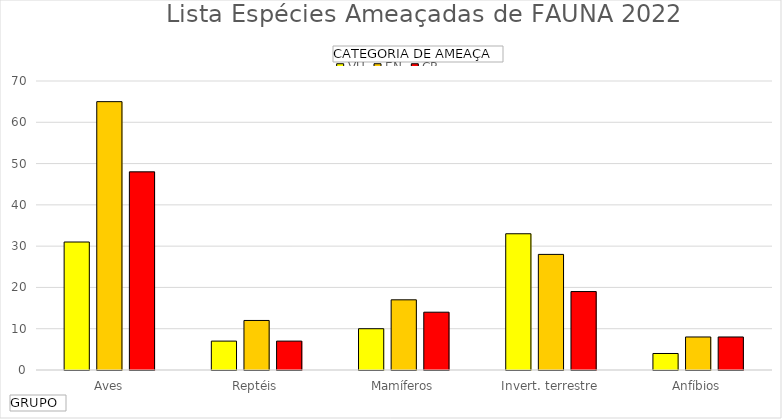
| Category | VU | EN | CR |
|---|---|---|---|
| Aves | 31 | 65 | 48 |
| Reptéis | 7 | 12 | 7 |
| Mamíferos | 10 | 17 | 14 |
| Invert. terrestre | 33 | 28 | 19 |
| Anfíbios | 4 | 8 | 8 |